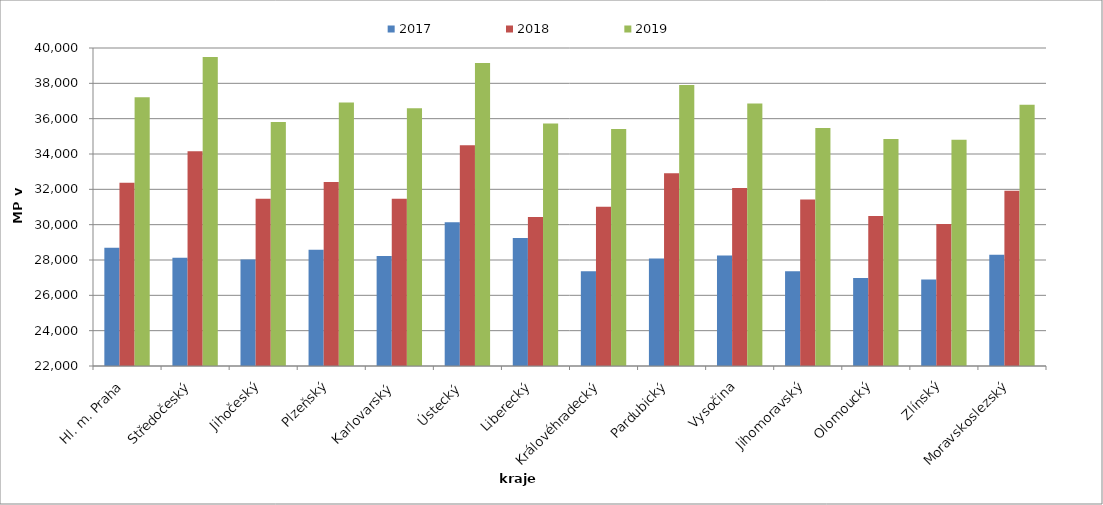
| Category | 2017 | 2018 | 2019 |
|---|---|---|---|
| Hl. m. Praha | 28692.094 | 32374.63 | 37208.28 |
| Středočeský | 28127.585 | 34162.097 | 39484.934 |
| Jihočeský | 28033.978 | 31472.308 | 35818.115 |
| Plzeňský | 28585.445 | 32416.723 | 36914.48 |
| Karlovarský  | 28228.138 | 31462.829 | 36585.604 |
| Ústecký   | 30141.205 | 34497.535 | 39153.486 |
| Liberecký | 29249.434 | 30439.786 | 35729.542 |
| Královéhradecký | 27364.034 | 31007.874 | 35416.629 |
| Pardubický | 28080.963 | 32910.763 | 37903.593 |
| Vysočina | 28260.345 | 32076.923 | 36854.54 |
| Jihomoravský | 27369.828 | 31424.472 | 35473.967 |
| Olomoucký | 26982.286 | 30489.01 | 34851.654 |
| Zlínský | 26899.793 | 30041.031 | 34811.527 |
| Moravskoslezský | 28299.22 | 31923.598 | 36783.967 |